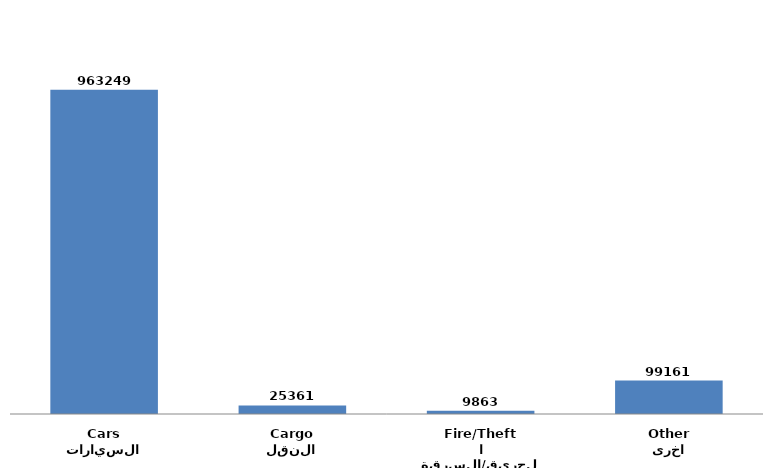
| Category | Series 0 |
|---|---|
| السيارات
Cars | 963249 |
| النقل
Cargo | 25361 |
| الحريق/السرقة
Fire/Theft | 9863 |
| اخرى
Other | 99161 |